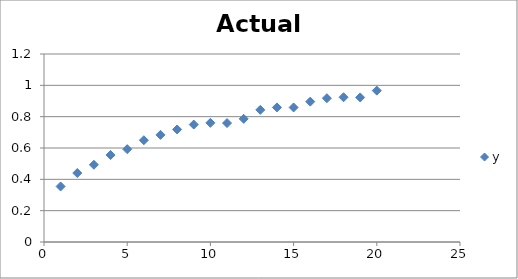
| Category | y |
|---|---|
| 1.0 | 0.354 |
| 2.0 | 0.44 |
| 3.0 | 0.493 |
| 4.0 | 0.555 |
| 5.0 | 0.593 |
| 6.0 | 0.65 |
| 7.0 | 0.684 |
| 8.0 | 0.718 |
| 9.0 | 0.75 |
| 10.0 | 0.761 |
| 11.0 | 0.759 |
| 12.0 | 0.786 |
| 13.0 | 0.843 |
| 14.0 | 0.859 |
| 15.0 | 0.859 |
| 16.0 | 0.896 |
| 17.0 | 0.918 |
| 18.0 | 0.924 |
| 19.0 | 0.923 |
| 20.0 | 0.966 |